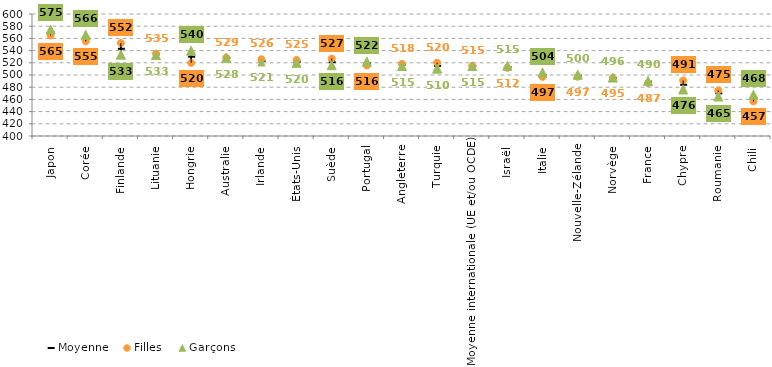
| Category | Moyenne | Filles | Garçons |
|---|---|---|---|
| Japon | 570 | 564.73 | 574.655 |
| Corée | 561 | 555.255 | 565.717 |
| Finlande | 543 | 552.406 | 533.375 |
| Lituanie | 534 | 535.039 | 532.589 |
| Hongrie | 530 | 519.807 | 539.79 |
| Australie | 528 | 528.5 | 528.177 |
| Irlande | 523 | 525.767 | 520.55 |
| États-Unis | 522 | 524.735 | 520.035 |
| Suède | 521 | 526.953 | 516.041 |
| Portugal | 519 | 515.51 | 521.96 |
| Angleterre | 517 | 518.273 | 514.876 |
| Turquie | 515 | 520.275 | 510.408 |
| Moyenne internationale (UE et/ou OCDE) | 514.75 | 514.872 | 514.621 |
| Israël | 513 | 511.745 | 514.981 |
| Italie | 500 | 496.883 | 504.02 |
| Nouvelle-Zélande | 499 | 497.199 | 500.428 |
| Norvège | 495 | 495.239 | 495.795 |
| France | 489 | 486.737 | 490.292 |
| Chypre | 484 | 491.001 | 476.297 |
| Roumanie | 470 | 474.699 | 464.736 |
| Chili | 462 | 456.688 | 467.688 |